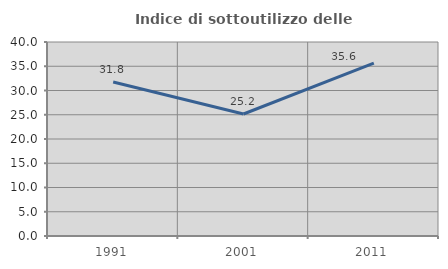
| Category | Indice di sottoutilizzo delle abitazioni  |
|---|---|
| 1991.0 | 31.752 |
| 2001.0 | 25.155 |
| 2011.0 | 35.629 |